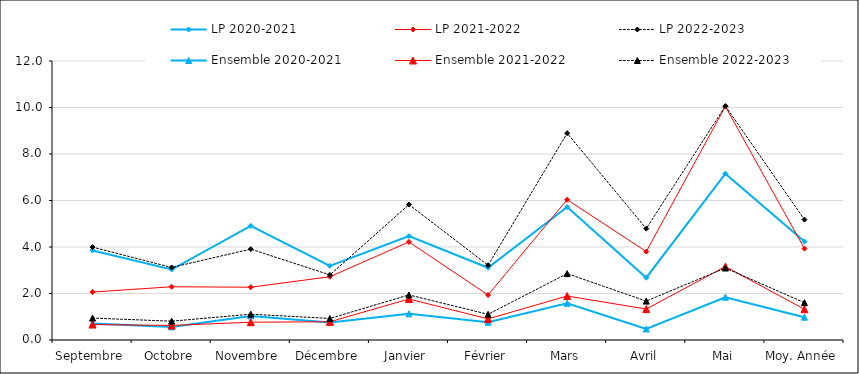
| Category | LP | Ensemble |
|---|---|---|
| Septembre | 3.995 | 0.943 |
| Octobre | 3.121 | 0.81 |
| Novembre | 3.91 | 1.11 |
| Décembre | 2.8 | 0.926 |
| Janvier | 5.825 | 1.938 |
| Février | 3.214 | 1.104 |
| Mars | 8.896 | 2.856 |
| Avril | 4.79 | 1.672 |
| Mai | 10.061 | 3.096 |
| Moy. Année | 5.179 | 1.606 |